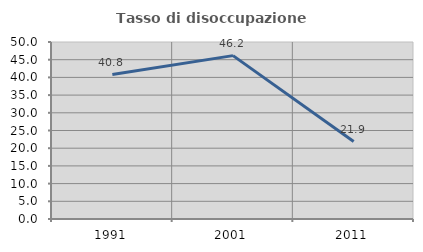
| Category | Tasso di disoccupazione giovanile  |
|---|---|
| 1991.0 | 40.789 |
| 2001.0 | 46.154 |
| 2011.0 | 21.875 |